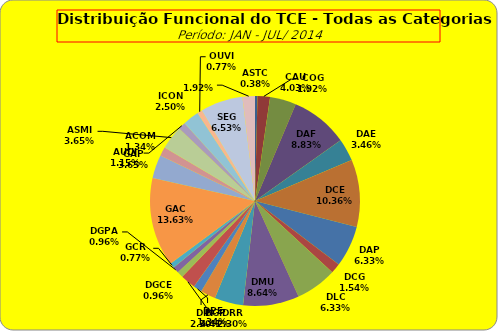
| Category | ASTC COG CAU DAF DAE DCE DAP DCG DLC DMU DGP DIN DPE DRR DGCE DGPA GCR GAC GAP ACOM ASMI AUDI ICON OUVI SEG |
|---|---|
| ASTC | 2 |
| COG | 10 |
| CAU | 21 |
| DAF | 46 |
| DAE | 18 |
| DCE | 54 |
| DAP | 33 |
| DCG | 8 |
| DLC | 33 |
| DMU | 45 |
| DGP | 23 |
| DIN | 12 |
| DPE | 7 |
| DRR | 12 |
| DGCE | 5 |
| DGPA | 5 |
| GCR | 4 |
| GAC | 71 |
| GAP | 19 |
| ACOM | 7 |
| ASMI | 19 |
| AUDI | 6 |
| ICON | 13 |
| OUVI | 4 |
| SEG | 34 |